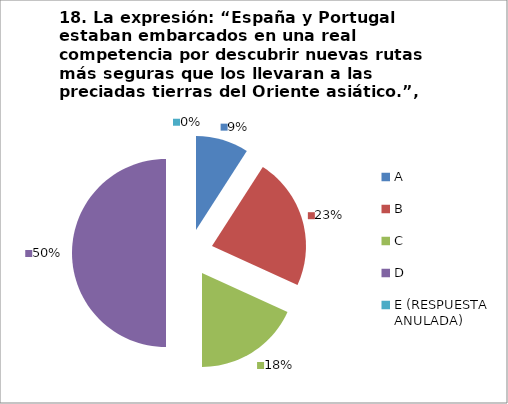
| Category | CANTIDAD DE RESPUESTAS PREGUNTA (18) | PORCENTAJE |
|---|---|---|
| A | 2 | 0.091 |
| B | 5 | 0.227 |
| C | 4 | 0.182 |
| D | 11 | 0.5 |
| E (RESPUESTA ANULADA) | 0 | 0 |